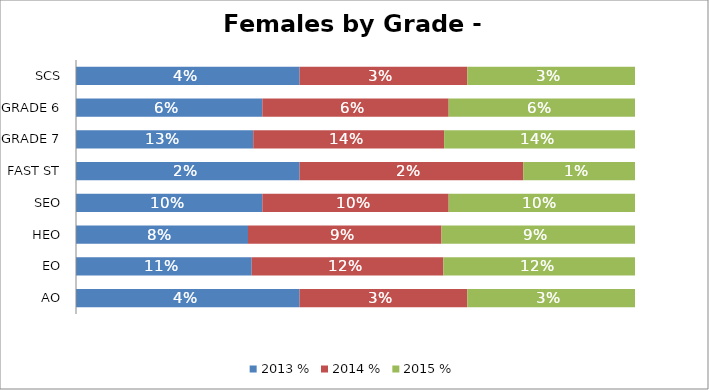
| Category | 2013 % | 2014 % | 2015 % |
|---|---|---|---|
| AO | 0.04 | 0.03 | 0.03 |
| EO | 0.11 | 0.12 | 0.12 |
| HEO | 0.08 | 0.09 | 0.09 |
| SEO | 0.1 | 0.1 | 0.1 |
| FAST ST | 0.02 | 0.02 | 0.01 |
| GRADE 7 | 0.13 | 0.14 | 0.14 |
| GRADE 6 | 0.06 | 0.06 | 0.06 |
| SCS | 0.04 | 0.03 | 0.03 |